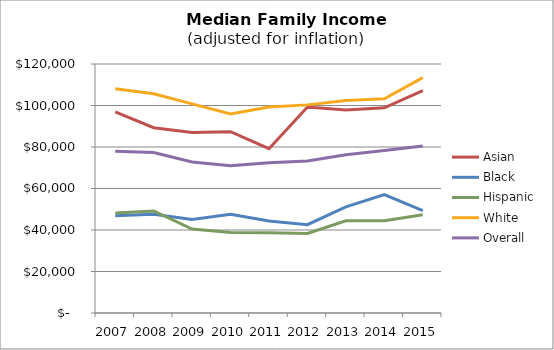
| Category | Asian | Black | Hispanic | White | Overall |
|---|---|---|---|---|---|
| 2007.0 | 96925.536 | 46823.523 | 48241.431 | 108067.681 | 77899.512 |
| 2008.0 | 89316.612 | 47587.269 | 49198.361 | 105617.964 | 77369.211 |
| 2009.0 | 86939.326 | 45007.783 | 40454.775 | 100794.891 | 72785.15 |
| 2010.0 | 87389.857 | 47563.372 | 38853.231 | 95929.064 | 70943.898 |
| 2011.0 | 79196.826 | 44354.613 | 38719.668 | 99250.024 | 72437.169 |
| 2012.0 | 99256.886 | 42557.364 | 38297.873 | 100301.973 | 73294.084 |
| 2013.0 | 97777.82 | 51141.366 | 44447.512 | 102418.906 | 76288.793 |
| 2014.0 | 98898.251 | 57040.626 | 44496.754 | 103206.358 | 78313.846 |
| 2015.0 | 107129.618 | 49313.344 | 47377.224 | 113410.869 | 80519 |